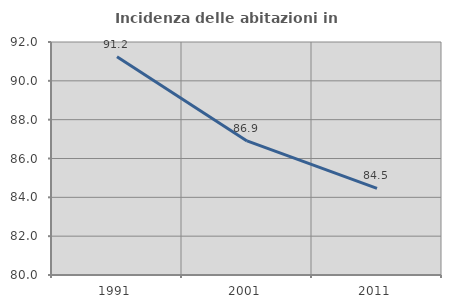
| Category | Incidenza delle abitazioni in proprietà  |
|---|---|
| 1991.0 | 91.235 |
| 2001.0 | 86.905 |
| 2011.0 | 84.462 |